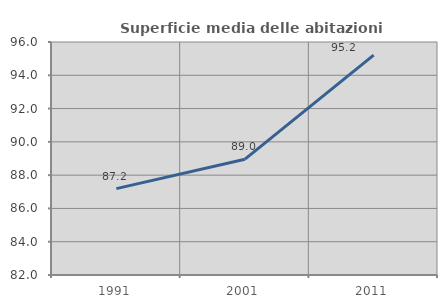
| Category | Superficie media delle abitazioni occupate |
|---|---|
| 1991.0 | 87.188 |
| 2001.0 | 88.958 |
| 2011.0 | 95.216 |